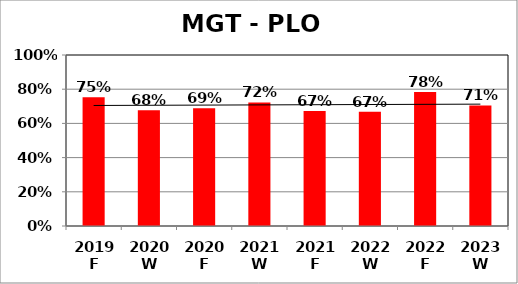
| Category | Series 0 |
|---|---|
| 2019 F | 0.752 |
| 2020 W | 0.677 |
| 2020 F | 0.688 |
| 2021 W | 0.722 |
| 2021 F | 0.672 |
| 2022 W | 0.668 |
| 2022 F | 0.784 |
| 2023 W | 0.705 |